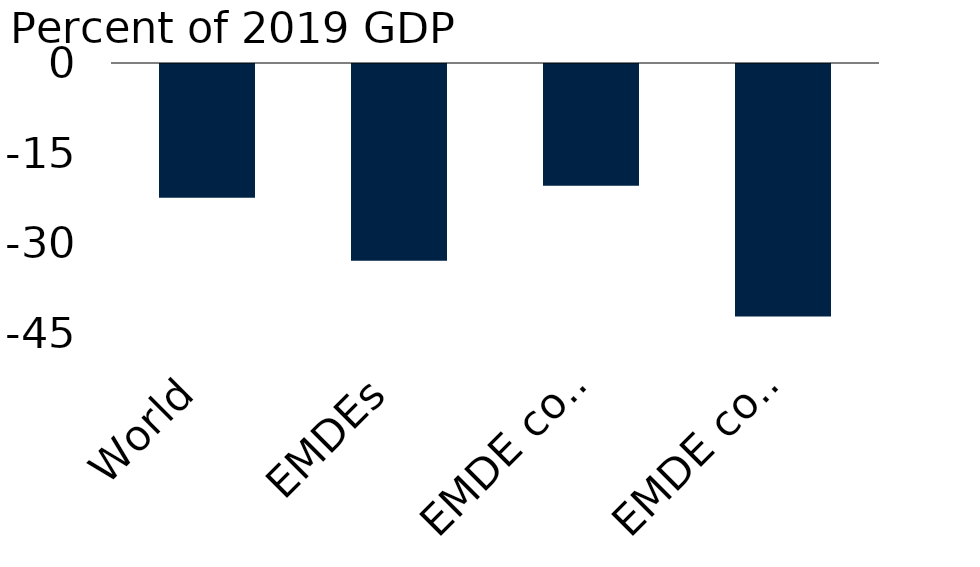
| Category | Series 0 |
|---|---|
| World | -22.3 |
| EMDEs | -32.8 |
| EMDE commodity exporters | -20.3 |
| EMDE commodity importers | -42.1 |